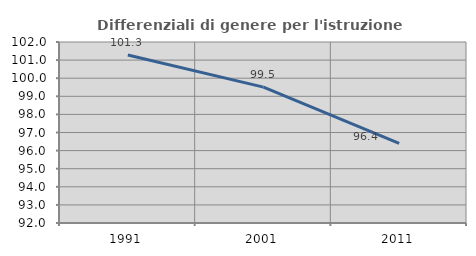
| Category | Differenziali di genere per l'istruzione superiore |
|---|---|
| 1991.0 | 101.283 |
| 2001.0 | 99.509 |
| 2011.0 | 96.404 |